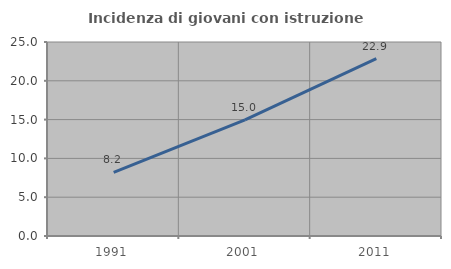
| Category | Incidenza di giovani con istruzione universitaria |
|---|---|
| 1991.0 | 8.187 |
| 2001.0 | 14.976 |
| 2011.0 | 22.857 |